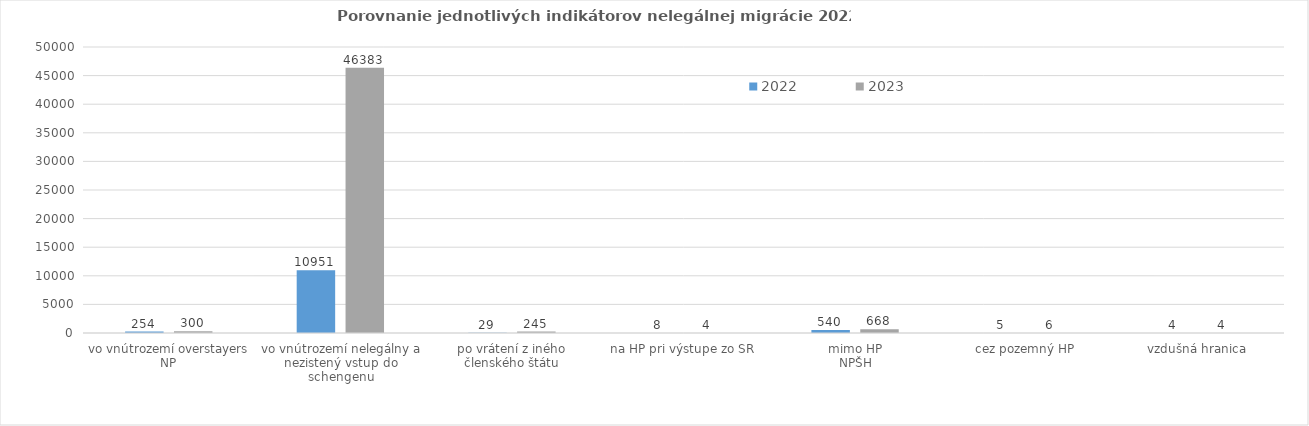
| Category | 2022 | 2023 |
|---|---|---|
| 0 | 254 | 300 |
| 1 | 10951 | 46383 |
| 2 | 29 | 245 |
| 3 | 8 | 4 |
| 4 | 540 | 668 |
| 5 | 5 | 6 |
| 6 | 4 | 4 |